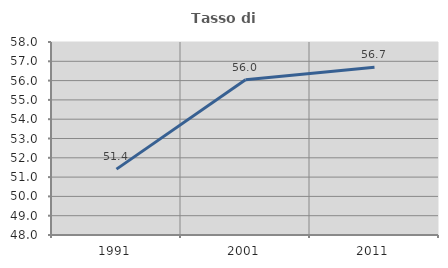
| Category | Tasso di occupazione   |
|---|---|
| 1991.0 | 51.413 |
| 2001.0 | 56.042 |
| 2011.0 | 56.697 |